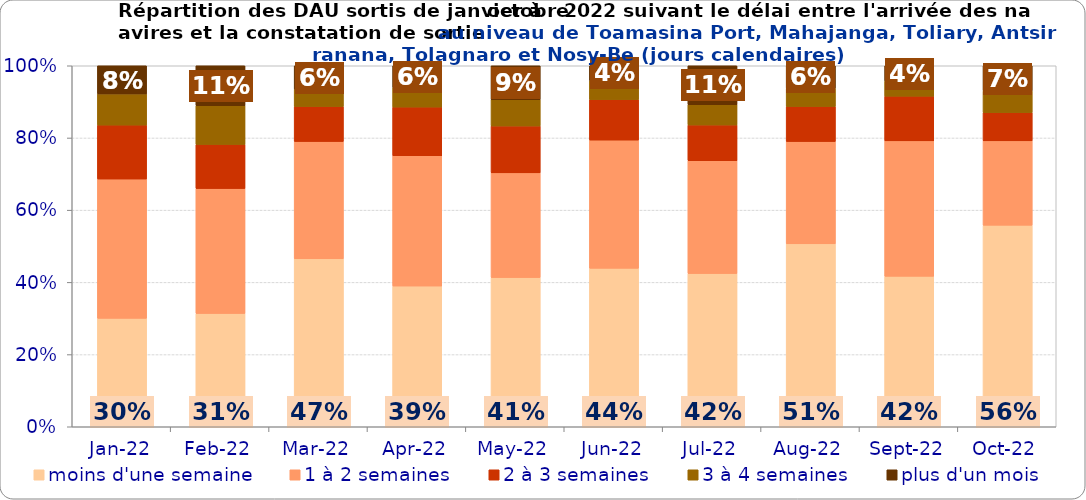
| Category | moins d'une semaine | 1 à 2 semaines | 2 à 3 semaines | 3 à 4 semaines | plus d'un mois |
|---|---|---|---|---|---|
| 2022-01-01 | 0.3 | 0.386 | 0.149 | 0.087 | 0.078 |
| 2022-02-01 | 0.314 | 0.346 | 0.122 | 0.107 | 0.111 |
| 2022-03-01 | 0.465 | 0.325 | 0.097 | 0.048 | 0.065 |
| 2022-04-01 | 0.39 | 0.361 | 0.135 | 0.054 | 0.061 |
| 2022-05-01 | 0.413 | 0.29 | 0.13 | 0.073 | 0.094 |
| 2022-06-01 | 0.439 | 0.355 | 0.112 | 0.053 | 0.041 |
| 2022-07-01 | 0.424 | 0.313 | 0.099 | 0.056 | 0.108 |
| 2022-08-01 | 0.507 | 0.283 | 0.097 | 0.051 | 0.062 |
| 2022-09-01 | 0.417 | 0.375 | 0.124 | 0.042 | 0.042 |
| 2022-10-01 | 0.558 | 0.234 | 0.078 | 0.06 | 0.07 |